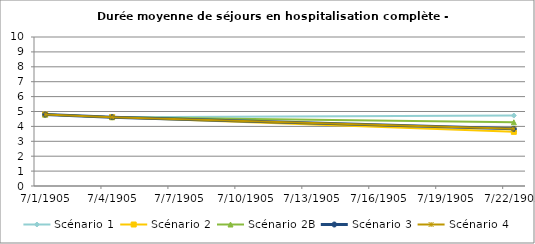
| Category | Scénario 1 | Scénario 2 | Scénario 2B | Scénario 3 | Scénario 4 |
|---|---|---|---|---|---|
| 2009.0 | 4.794 | 4.794 | 4.794 | 4.794 | 4.794 |
| 2012.0 | 4.62 | 4.62 | 4.62 | 4.62 | 4.62 |
| 2030.0 | 4.728 | 3.633 | 4.276 | 3.834 | 3.834 |